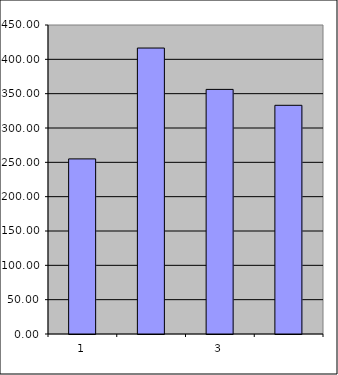
| Category | Series 0 |
|---|---|
| 0 | 255 |
| 1 | 416.44 |
| 2 | 356.217 |
| 3 | 333.061 |